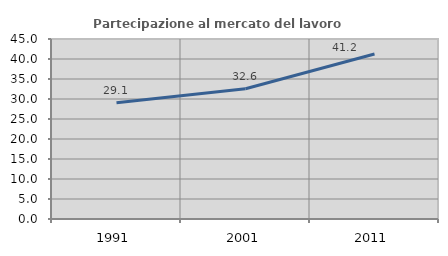
| Category | Partecipazione al mercato del lavoro  femminile |
|---|---|
| 1991.0 | 29.051 |
| 2001.0 | 32.551 |
| 2011.0 | 41.236 |